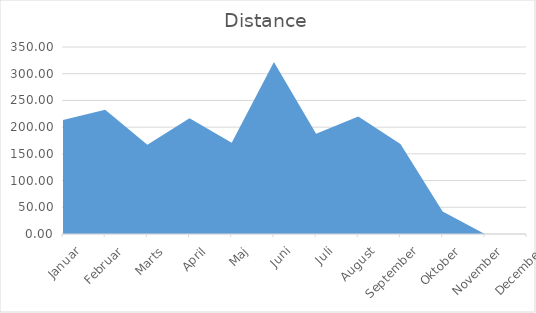
| Category | Distance |
|---|---|
| Januar | 213.31 |
| Februar | 232.7 |
| Marts | 167.01 |
| April | 216.51 |
| Maj | 170.76 |
| Juni | 322.14 |
| Juli | 187.49 |
| August | 220.14 |
| September | 168.29 |
| Oktober | 42.25 |
| November | 0 |
| December | 0 |